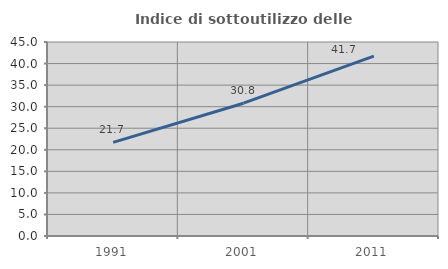
| Category | Indice di sottoutilizzo delle abitazioni  |
|---|---|
| 1991.0 | 21.709 |
| 2001.0 | 30.804 |
| 2011.0 | 41.716 |